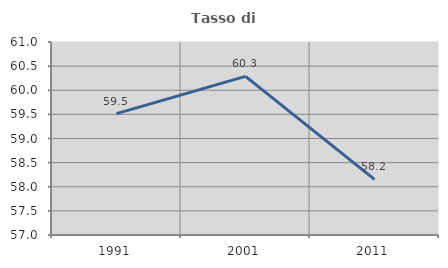
| Category | Tasso di occupazione   |
|---|---|
| 1991.0 | 59.516 |
| 2001.0 | 60.287 |
| 2011.0 | 58.154 |